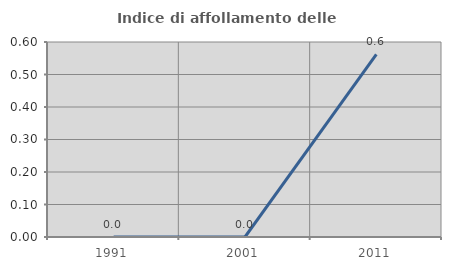
| Category | Indice di affollamento delle abitazioni  |
|---|---|
| 1991.0 | 0 |
| 2001.0 | 0 |
| 2011.0 | 0.562 |